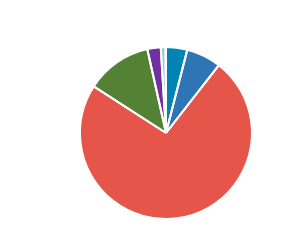
| Category | Series 0 |
|---|---|
| PC | 2311 |
| MC | 3797 |
| CAR | 42650 |
| LGV | 7176 |
| OGV1 | 1460 |
| OGV2 | 521 |
| PSV | 46 |